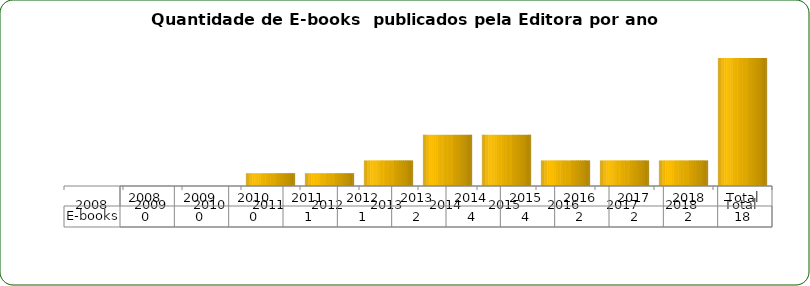
| Category | E-books |
|---|---|
| 2008 | 0 |
| 2009 | 0 |
| 2010 | 0 |
| 2011 | 1 |
| 2012 | 1 |
| 2013 | 2 |
| 2014 | 4 |
| 2015 | 4 |
| 2016 | 2 |
| 2017 | 2 |
| 2018 | 2 |
| Total | 18 |